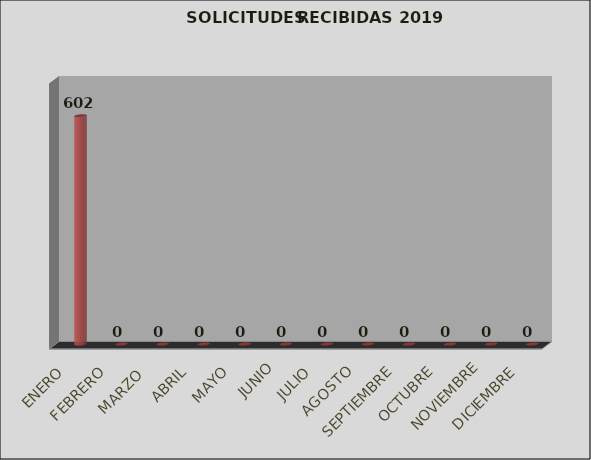
| Category | Series 0 | Series 1 |
|---|---|---|
| ENERO |  | 602 |
| FEBRERO |  | 0 |
| MARZO  |  | 0 |
| ABRIL |  | 0 |
| MAYO |  | 0 |
| JUNIO |  | 0 |
| JULIO |  | 0 |
| AGOSTO |  | 0 |
| SEPTIEMBRE |  | 0 |
| OCTUBRE |  | 0 |
| NOVIEMBRE |  | 0 |
| DICIEMBRE |  | 0 |